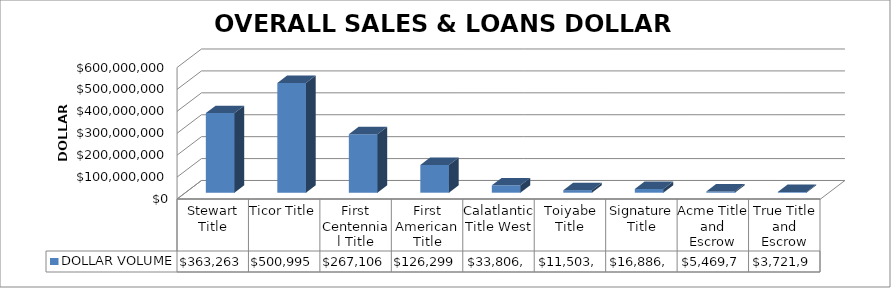
| Category | DOLLAR VOLUME |
|---|---|
| Stewart Title | 363263195.83 |
| Ticor Title | 500995859.35 |
| First Centennial Title | 267106783.7 |
| First American Title | 126299857.83 |
| Calatlantic Title West | 33806810 |
| Toiyabe Title | 11503383 |
| Signature Title | 16886913 |
| Acme Title and Escrow | 5469745 |
| True Title and Escrow | 3721998 |